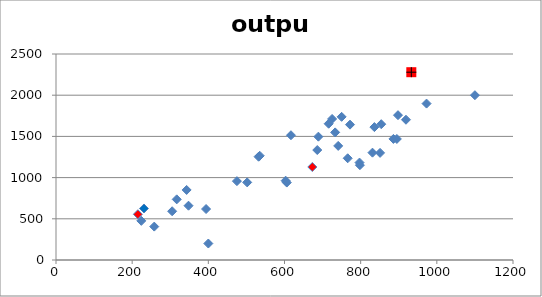
| Category | output |
|---|---|
| 617.0 | 1514.147 |
| 933.0 | 2279.163 |
| 686.0 | 1334.711 |
| 798.0 | 1150.989 |
| 772.0 | 1642.587 |
| 898.0 | 1757.538 |
| 689.0 | 1496.801 |
| 475.0 | 956.945 |
| 231.0 | 625.291 |
| 224.0 | 475.19 |
| 603.0 | 962.697 |
| 733.0 | 1548.566 |
| 716.0 | 1653.821 |
| 343.0 | 850.223 |
| 400.0 | 200 |
| 973.0 | 1898.314 |
| 741.0 | 1384.62 |
| 831.0 | 1302.686 |
| 1100.0 | 2000 |
| 215.0 | 555.154 |
| 886.0 | 1469.224 |
| 750.0 | 1737.354 |
| 348.0 | 658.775 |
| 535.0 | 1264.963 |
| 394.0 | 618.638 |
| 797.0 | 1182.389 |
| 305.0 | 591.479 |
| 258.0 | 405.288 |
| 532.0 | 1253.423 |
| 895.0 | 1468.858 |
| 851.0 | 1299.921 |
| 725.0 | 1711.766 |
| 919.0 | 1702.145 |
| 317.0 | 735.977 |
| 836.0 | 1612.591 |
| 606.0 | 939.599 |
| 673.0 | 1128.763 |
| 766.0 | 1234.602 |
| 854.0 | 1648.183 |
| 502.0 | 941.723 |